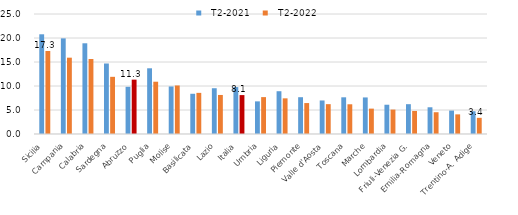
| Category |   T2-2021 |   T2-2022 |
|---|---|---|
|   Sicilia | 20.773 | 17.298 |
|   Campania | 19.924 | 15.902 |
|   Calabria | 18.9 | 15.621 |
|   Sardegna | 14.688 | 11.912 |
|   Abruzzo | 9.837 | 11.322 |
|   Puglia | 13.69 | 10.893 |
|   Molise | 9.902 | 10.109 |
|   Basilicata | 8.382 | 8.571 |
|   Lazio | 9.536 | 8.133 |
| Italia | 9.774 | 8.105 |
|   Umbria | 6.8 | 7.684 |
|   Liguria | 8.912 | 7.43 |
|   Piemonte | 7.666 | 6.445 |
|   Valle d'Aosta | 6.985 | 6.217 |
|   Toscana | 7.645 | 6.192 |
|   Marche | 7.617 | 5.287 |
|   Lombardia | 6.1 | 5.089 |
|   Friuli-Venezia G. | 6.213 | 4.804 |
|   Emilia-Romagna | 5.569 | 4.537 |
|   Veneto | 4.881 | 4.09 |
|   Trentino-A. Adige | 4.738 | 3.37 |